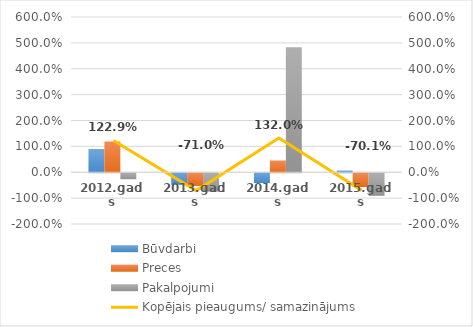
| Category | Būvdarbi | Preces | Pakalpojumi |
|---|---|---|---|
| 2012.gads | 0.896 | 1.184 | -0.234 |
| 2013.gads | -0.449 | -0.491 | -0.711 |
| 2014.gads | -0.379 | 0.45 | 4.833 |
| 2015.gads | 0.068 | -0.532 | -0.873 |